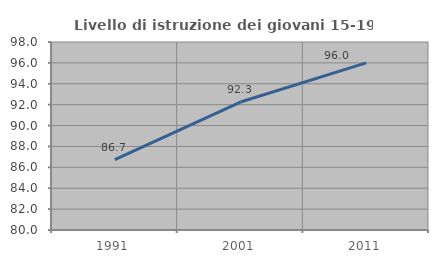
| Category | Livello di istruzione dei giovani 15-19 anni |
|---|---|
| 1991.0 | 86.73 |
| 2001.0 | 92.254 |
| 2011.0 | 96 |